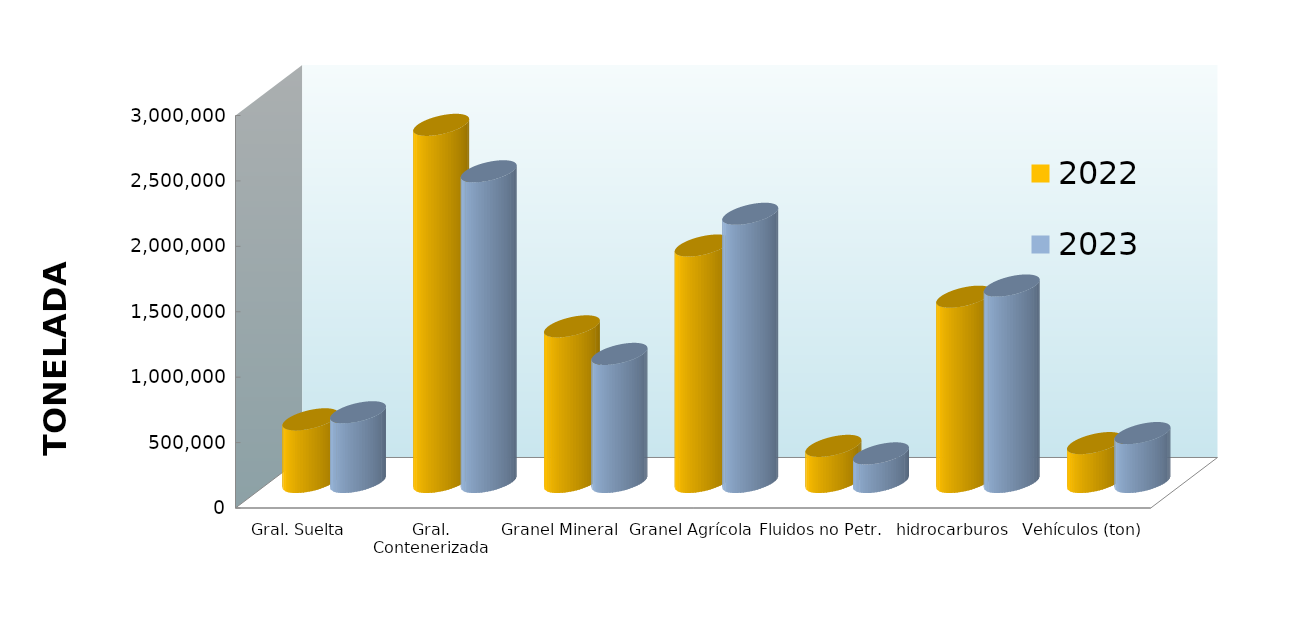
| Category | 2022 | 2023 |
|---|---|---|
| Gral. Suelta | 479104.989 | 532968.282 |
| Gral. Contenerizada | 2729786.22 | 2374912.15 |
| Granel Mineral | 1189643.088 | 979141.584 |
| Granel Agrícola | 1807316.26 | 2049939.6 |
| Fluidos no Petr. | 276124.821 | 218707.318 |
| hidrocarburos | 1416295.513 | 1501823.574 |
| Vehículos (ton) | 297259.439 | 374020.766 |